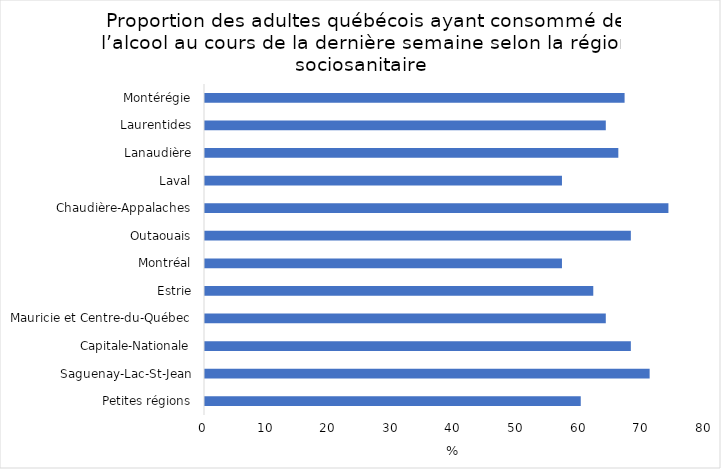
| Category | Series 0 |
|---|---|
| Petites régions | 60 |
| Saguenay-Lac-St-Jean | 71 |
| Capitale-Nationale | 68 |
| Mauricie et Centre-du-Québec | 64 |
| Estrie | 62 |
| Montréal | 57 |
| Outaouais | 68 |
| Chaudière-Appalaches | 74 |
| Laval | 57 |
| Lanaudière | 66 |
| Laurentides | 64 |
| Montérégie | 67 |